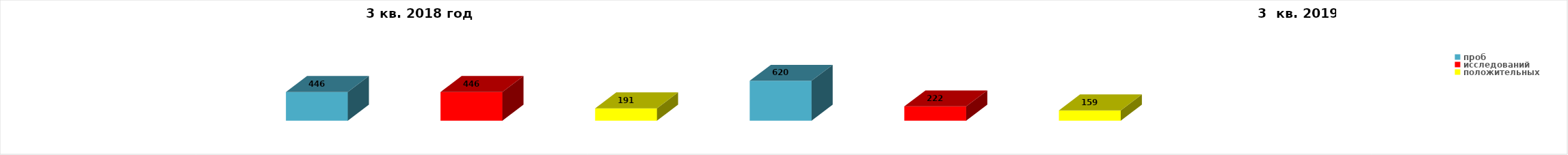
| Category | Series 4 |
|---|---|
| проб | 446 |
| исследований | 446 |
| положительных | 191 |
| проб | 620 |
| исследований | 222 |
| положительных | 159 |